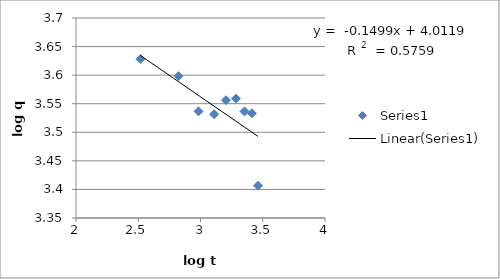
| Category | Series 0 |
|---|---|
| 2.5178229247186246 | 3.628 |
| 2.823392178649965 | 3.598 |
| 2.9842451166832396 | 3.537 |
| 3.1095632508638413 | 3.532 |
| 3.2046785945137493 | 3.556 |
| 3.285093392247937 | 3.559 |
| 3.3535518916942215 | 3.536 |
| 3.4126804905085413 | 3.533 |
| 3.4617184895267266 | 3.406 |